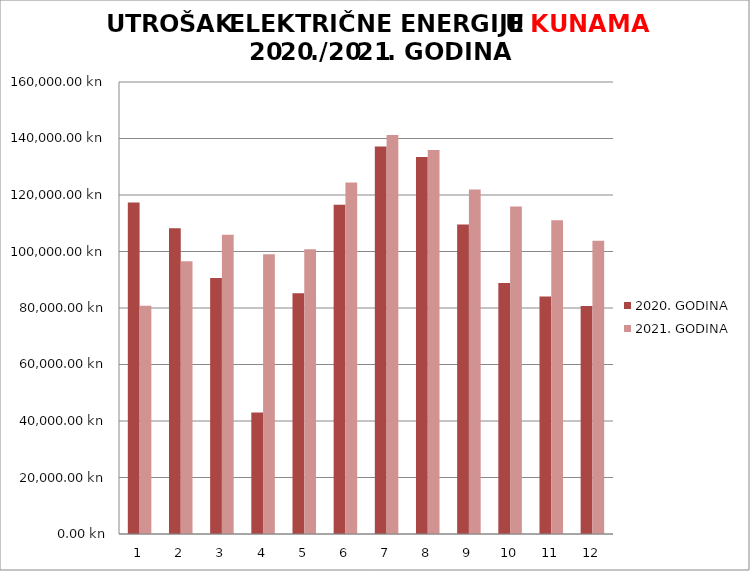
| Category | 2020. GODINA | 2021. GODINA |
|---|---|---|
| 0 | 117377.64 | 80815.97 |
| 1 | 108260.78 | 96548.61 |
| 2 | 90653.89 | 105896.77 |
| 3 | 42979.23 | 99025.52 |
| 4 | 85233.25 | 100807.03 |
| 5 | 116565.56 | 124448.45 |
| 6 | 137175.97 | 141199.24 |
| 7 | 133427.96 | 135953.31 |
| 8 | 109585.59 | 121955.08 |
| 9 | 88817.27 | 115892.32 |
| 10 | 84089.95 | 111043.11 |
| 11 | 80709.85 | 103846.04 |